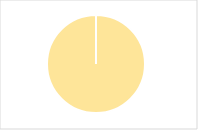
| Category | Total |
|---|---|
| Y | 0 |
| R | 0 |
| T | 0 |
| M | 0 |
| F | 0 |
| N | 133 |